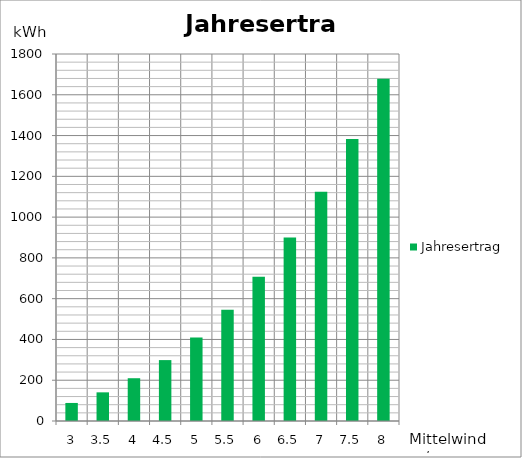
| Category | Jahresertrag |
|---|---|
| 3.0 | 88.509 |
| 3.5 | 140.549 |
| 4.0 | 209.799 |
| 4.5 | 298.718 |
| 5.0 | 409.764 |
| 5.5 | 545.396 |
| 6.0 | 708.073 |
| 6.5 | 900.252 |
| 7.0 | 1124.393 |
| 7.5 | 1382.954 |
| 8.0 | 1678.394 |